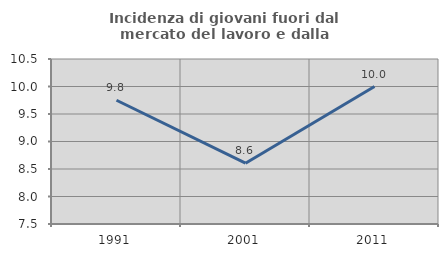
| Category | Incidenza di giovani fuori dal mercato del lavoro e dalla formazione  |
|---|---|
| 1991.0 | 9.75 |
| 2001.0 | 8.605 |
| 2011.0 | 10 |